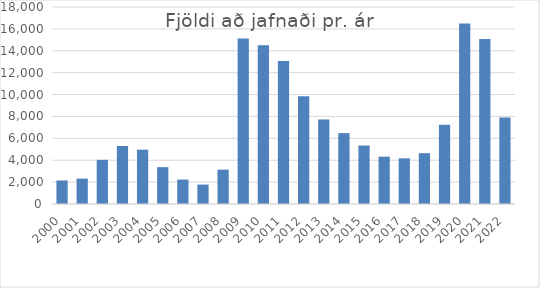
| Category | Allir |
|---|---|
| 2000.0 | 2149 |
| 2001.0 | 2319 |
| 2002.0 | 4037 |
| 2003.0 | 5299 |
| 2004.0 | 4962 |
| 2005.0 | 3366 |
| 2006.0 | 2231 |
| 2007.0 | 1774 |
| 2008.0 | 3139 |
| 2009.0 | 15121 |
| 2010.0 | 14503 |
| 2011.0 | 13066 |
| 2012.0 | 9838 |
| 2013.0 | 7726 |
| 2014.0 | 6474 |
| 2015.0 | 5342 |
| 2016.0 | 4324 |
| 2017.0 | 4171 |
| 2018.0 | 4643 |
| 2019.0 | 7238 |
| 2020.0 | 16496.333 |
| 2021.0 | 15082 |
| 2022.0 | 7899.833 |